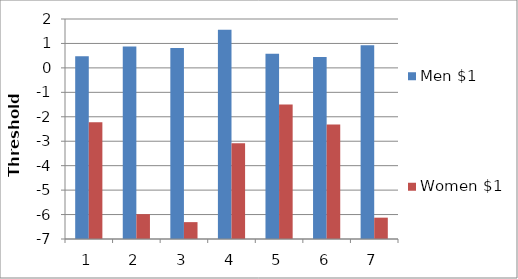
| Category | Men $1 | Women $1 |
|---|---|---|
| 0 | 0.473 | -2.22 |
| 1 | 0.876 | -5.983 |
| 2 | 0.811 | -6.31 |
| 3 | 1.559 | -3.079 |
| 4 | 0.58 | -1.495 |
| 5 | 0.441 | -2.317 |
| 6 | 0.924 | -6.127 |